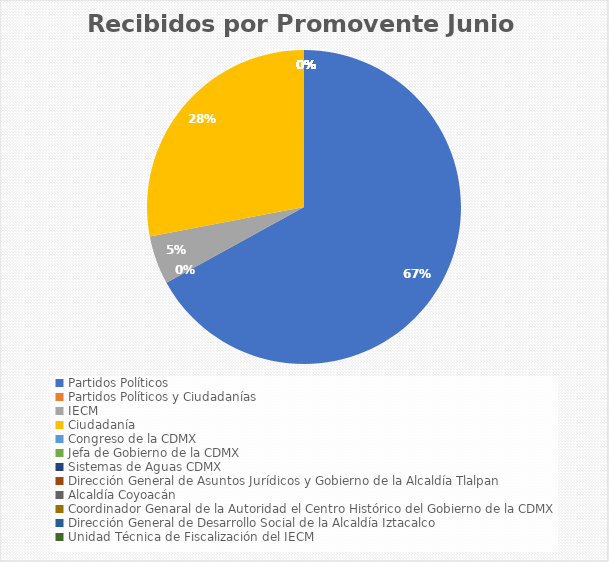
| Category | Recibidos por Promovente Junio |
|---|---|
| Partidos Políticos | 134 |
| Partidos Políticos y Ciudadanías | 0 |
| IECM | 10 |
| Ciudadanía  | 56 |
| Congreso de la CDMX | 0 |
| Jefa de Gobierno de la CDMX | 0 |
| Sistemas de Aguas CDMX | 0 |
| Dirección General de Asuntos Jurídicos y Gobierno de la Alcaldía Tlalpan | 0 |
| Alcaldía Coyoacán | 0 |
| Coordinador Genaral de la Autoridad el Centro Histórico del Gobierno de la CDMX | 0 |
| Dirección General de Desarrollo Social de la Alcaldía Iztacalco | 0 |
| Unidad Técnica de Fiscalización del IECM | 0 |